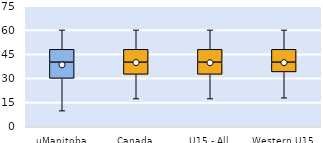
| Category | 25th | 50th | 75th |
|---|---|---|---|
| uManitoba | 30 | 10 | 8 |
| Canada | 32.5 | 7.5 | 8 |
| U15 - All | 32.5 | 7.5 | 8 |
| Western U15 | 34 | 6 | 8 |